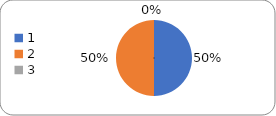
| Category | Series 0 |
|---|---|
| 0 | 54 |
| 1 | 54 |
| 2 | 0 |